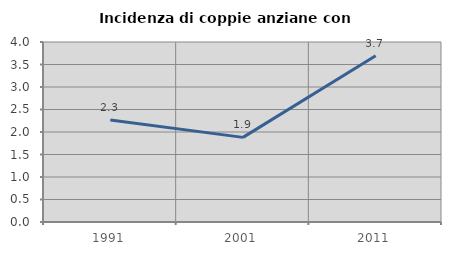
| Category | Incidenza di coppie anziane con figli |
|---|---|
| 1991.0 | 2.265 |
| 2001.0 | 1.88 |
| 2011.0 | 3.695 |